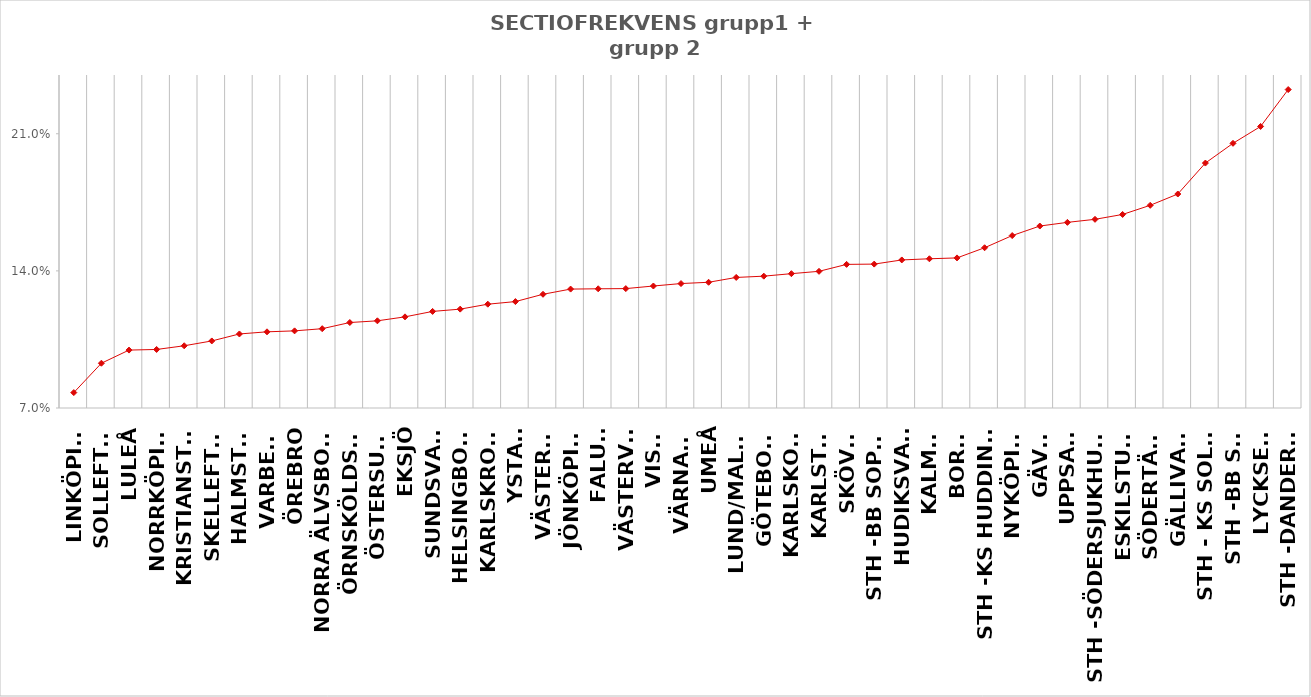
| Category | Series 0 |
|---|---|
| Linköping | 0.078 |
| Sollefteå | 0.093 |
| Luleå | 0.1 |
| Norrköping | 0.1 |
| Kristianstad | 0.102 |
| Skellefteå | 0.104 |
| Halmstad | 0.108 |
| Varberg | 0.109 |
| Örebro | 0.109 |
| Norra Älvsborg | 0.11 |
| Örnsköldsvik | 0.114 |
| Östersund | 0.115 |
| Eksjö | 0.117 |
| Sundsvall | 0.119 |
| Helsingborg | 0.12 |
| Karlskrona | 0.123 |
| Ystad | 0.124 |
| Västerås | 0.128 |
| Jönköping | 0.131 |
| Falun | 0.131 |
| Västervik | 0.131 |
| Visby | 0.132 |
| Värnamo | 0.134 |
| Umeå | 0.134 |
| Lund/Malmö | 0.137 |
| Göteborg | 0.137 |
| Karlskoga | 0.139 |
| Karlstad | 0.14 |
| Skövde | 0.143 |
| Sth -BB Sophia | 0.143 |
| Hudiksvall | 0.146 |
| Kalmar | 0.146 |
| Borås | 0.147 |
| Sth -KS Huddinge | 0.152 |
| Nyköping | 0.158 |
| Gävle | 0.163 |
| Uppsala | 0.165 |
| Sth -Södersjukhuset | 0.166 |
| Eskilstuna | 0.169 |
| Södertälje | 0.173 |
| Gällivare | 0.179 |
| Sth - KS Solna | 0.195 |
| Sth -BB Sth | 0.205 |
| Lycksele | 0.214 |
| Sth -Danderyd | 0.233 |